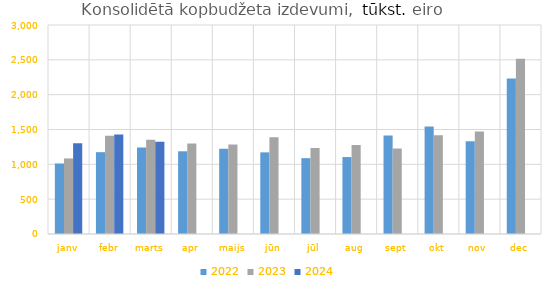
| Category | 2022 | 2023 | 2024 |
|---|---|---|---|
| janv | 1011780.956 | 1084456.317 | 1303627.651 |
| febr | 1174583.857 | 1410804.255 | 1427917.609 |
| marts | 1242068.533 | 1353313.614 | 1322792.966 |
| apr | 1187341.457 | 1300627.878 | 0 |
| maijs | 1224137.323 | 1285511.298 | 0 |
| jūn | 1172050.575 | 1387062.669 | 0 |
| jūl | 1088648.602 | 1233758.467 | 0 |
| aug | 1104689.423 | 1277311.998 | 0 |
| sept | 1413387.204 | 1228203.988 | 0 |
| okt | 1543583.073 | 1416444.394 | 0 |
| nov | 1331354.715 | 1471104.645 | 0 |
| dec | 2230910.603 | 2516060.844 | 0 |